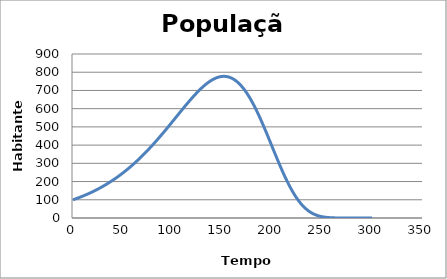
| Category | Series 0 |
|---|---|
| 1.0 | 100 |
| 2.0 | 101.9 |
| 3.0 | 103.834 |
| 4.0 | 105.803 |
| 5.0 | 107.806 |
| 6.0 | 109.846 |
| 7.0 | 111.922 |
| 8.0 | 114.034 |
| 9.0 | 116.184 |
| 10.0 | 118.371 |
| 11.0 | 120.597 |
| 12.0 | 122.862 |
| 13.0 | 125.166 |
| 14.0 | 127.511 |
| 15.0 | 129.896 |
| 16.0 | 132.323 |
| 17.0 | 134.791 |
| 18.0 | 137.302 |
| 19.0 | 139.855 |
| 20.0 | 142.453 |
| 21.0 | 145.094 |
| 22.0 | 147.78 |
| 23.0 | 150.512 |
| 24.0 | 153.289 |
| 25.0 | 156.113 |
| 26.0 | 158.984 |
| 27.0 | 161.903 |
| 28.0 | 164.87 |
| 29.0 | 167.885 |
| 30.0 | 170.951 |
| 31.0 | 174.066 |
| 32.0 | 177.232 |
| 33.0 | 180.449 |
| 34.0 | 183.717 |
| 35.0 | 187.038 |
| 36.0 | 190.412 |
| 37.0 | 193.839 |
| 38.0 | 197.32 |
| 39.0 | 200.855 |
| 40.0 | 204.446 |
| 41.0 | 208.091 |
| 42.0 | 211.793 |
| 43.0 | 215.551 |
| 44.0 | 219.367 |
| 45.0 | 223.239 |
| 46.0 | 227.17 |
| 47.0 | 231.159 |
| 48.0 | 235.206 |
| 49.0 | 239.313 |
| 50.0 | 243.479 |
| 51.0 | 247.705 |
| 52.0 | 251.991 |
| 53.0 | 256.338 |
| 54.0 | 260.746 |
| 55.0 | 265.215 |
| 56.0 | 269.745 |
| 57.0 | 274.336 |
| 58.0 | 278.99 |
| 59.0 | 283.705 |
| 60.0 | 288.483 |
| 61.0 | 293.323 |
| 62.0 | 298.224 |
| 63.0 | 303.189 |
| 64.0 | 308.215 |
| 65.0 | 313.303 |
| 66.0 | 318.454 |
| 67.0 | 323.667 |
| 68.0 | 328.941 |
| 69.0 | 334.276 |
| 70.0 | 339.673 |
| 71.0 | 345.131 |
| 72.0 | 350.649 |
| 73.0 | 356.227 |
| 74.0 | 361.865 |
| 75.0 | 367.561 |
| 76.0 | 373.316 |
| 77.0 | 379.128 |
| 78.0 | 384.997 |
| 79.0 | 390.922 |
| 80.0 | 396.902 |
| 81.0 | 402.936 |
| 82.0 | 409.023 |
| 83.0 | 415.161 |
| 84.0 | 421.35 |
| 85.0 | 427.588 |
| 86.0 | 433.874 |
| 87.0 | 440.206 |
| 88.0 | 446.582 |
| 89.0 | 453.001 |
| 90.0 | 459.462 |
| 91.0 | 465.961 |
| 92.0 | 472.497 |
| 93.0 | 479.069 |
| 94.0 | 485.673 |
| 95.0 | 492.307 |
| 96.0 | 498.969 |
| 97.0 | 505.656 |
| 98.0 | 512.366 |
| 99.0 | 519.096 |
| 100.0 | 525.841 |
| 101.0 | 532.601 |
| 102.0 | 539.371 |
| 103.0 | 546.147 |
| 104.0 | 552.927 |
| 105.0 | 559.706 |
| 106.0 | 566.481 |
| 107.0 | 573.249 |
| 108.0 | 580.003 |
| 109.0 | 586.742 |
| 110.0 | 593.459 |
| 111.0 | 600.151 |
| 112.0 | 606.813 |
| 113.0 | 613.44 |
| 114.0 | 620.026 |
| 115.0 | 626.568 |
| 116.0 | 633.059 |
| 117.0 | 639.494 |
| 118.0 | 645.867 |
| 119.0 | 652.173 |
| 120.0 | 658.405 |
| 121.0 | 664.559 |
| 122.0 | 670.626 |
| 123.0 | 676.602 |
| 124.0 | 682.479 |
| 125.0 | 688.251 |
| 126.0 | 693.911 |
| 127.0 | 699.452 |
| 128.0 | 704.867 |
| 129.0 | 710.149 |
| 130.0 | 715.291 |
| 131.0 | 720.285 |
| 132.0 | 725.125 |
| 133.0 | 729.801 |
| 134.0 | 734.307 |
| 135.0 | 738.635 |
| 136.0 | 742.777 |
| 137.0 | 746.726 |
| 138.0 | 750.473 |
| 139.0 | 754.01 |
| 140.0 | 757.33 |
| 141.0 | 760.425 |
| 142.0 | 763.286 |
| 143.0 | 765.906 |
| 144.0 | 768.277 |
| 145.0 | 770.391 |
| 146.0 | 772.241 |
| 147.0 | 773.818 |
| 148.0 | 775.116 |
| 149.0 | 776.126 |
| 150.0 | 776.842 |
| 151.0 | 777.257 |
| 152.0 | 777.363 |
| 153.0 | 777.154 |
| 154.0 | 776.623 |
| 155.0 | 775.765 |
| 156.0 | 774.573 |
| 157.0 | 773.042 |
| 158.0 | 771.167 |
| 159.0 | 768.943 |
| 160.0 | 766.364 |
| 161.0 | 763.428 |
| 162.0 | 760.131 |
| 163.0 | 756.468 |
| 164.0 | 752.439 |
| 165.0 | 748.039 |
| 166.0 | 743.269 |
| 167.0 | 738.126 |
| 168.0 | 732.61 |
| 169.0 | 726.722 |
| 170.0 | 720.462 |
| 171.0 | 713.831 |
| 172.0 | 706.831 |
| 173.0 | 699.467 |
| 174.0 | 691.74 |
| 175.0 | 683.654 |
| 176.0 | 675.217 |
| 177.0 | 666.431 |
| 178.0 | 657.305 |
| 179.0 | 647.846 |
| 180.0 | 638.062 |
| 181.0 | 627.96 |
| 182.0 | 617.552 |
| 183.0 | 606.848 |
| 184.0 | 595.859 |
| 185.0 | 584.596 |
| 186.0 | 573.073 |
| 187.0 | 561.303 |
| 188.0 | 549.301 |
| 189.0 | 537.081 |
| 190.0 | 524.659 |
| 191.0 | 512.051 |
| 192.0 | 499.275 |
| 193.0 | 486.348 |
| 194.0 | 473.287 |
| 195.0 | 460.112 |
| 196.0 | 446.841 |
| 197.0 | 433.494 |
| 198.0 | 420.091 |
| 199.0 | 406.651 |
| 200.0 | 393.195 |
| 201.0 | 379.744 |
| 202.0 | 366.317 |
| 203.0 | 352.936 |
| 204.0 | 339.621 |
| 205.0 | 326.392 |
| 206.0 | 313.269 |
| 207.0 | 300.272 |
| 208.0 | 287.422 |
| 209.0 | 274.736 |
| 210.0 | 262.233 |
| 211.0 | 249.932 |
| 212.0 | 237.849 |
| 213.0 | 226.002 |
| 214.0 | 214.405 |
| 215.0 | 203.074 |
| 216.0 | 192.023 |
| 217.0 | 181.265 |
| 218.0 | 170.81 |
| 219.0 | 160.672 |
| 220.0 | 150.858 |
| 221.0 | 141.377 |
| 222.0 | 132.236 |
| 223.0 | 123.442 |
| 224.0 | 115 |
| 225.0 | 106.911 |
| 226.0 | 99.179 |
| 227.0 | 91.805 |
| 228.0 | 84.787 |
| 229.0 | 78.125 |
| 230.0 | 71.816 |
| 231.0 | 65.855 |
| 232.0 | 60.237 |
| 233.0 | 54.957 |
| 234.0 | 50.008 |
| 235.0 | 45.38 |
| 236.0 | 41.065 |
| 237.0 | 37.054 |
| 238.0 | 33.336 |
| 239.0 | 29.9 |
| 240.0 | 26.734 |
| 241.0 | 23.826 |
| 242.0 | 21.164 |
| 243.0 | 18.735 |
| 244.0 | 16.527 |
| 245.0 | 14.526 |
| 246.0 | 12.72 |
| 247.0 | 11.095 |
| 248.0 | 9.639 |
| 249.0 | 8.34 |
| 250.0 | 7.186 |
| 251.0 | 6.164 |
| 252.0 | 5.264 |
| 253.0 | 4.474 |
| 254.0 | 3.784 |
| 255.0 | 3.185 |
| 256.0 | 2.667 |
| 257.0 | 2.221 |
| 258.0 | 1.84 |
| 259.0 | 1.515 |
| 260.0 | 1.24 |
| 261.0 | 1.009 |
| 262.0 | 0.816 |
| 263.0 | 0.655 |
| 264.0 | 0.522 |
| 265.0 | 0.413 |
| 266.0 | 0.325 |
| 267.0 | 0.253 |
| 268.0 | 0.196 |
| 269.0 | 0.15 |
| 270.0 | 0.114 |
| 271.0 | 0.086 |
| 272.0 | 0.064 |
| 273.0 | 0.047 |
| 274.0 | 0.035 |
| 275.0 | 0.025 |
| 276.0 | 0.018 |
| 277.0 | 0.013 |
| 278.0 | 0.009 |
| 279.0 | 0.006 |
| 280.0 | 0.004 |
| 281.0 | 0.003 |
| 282.0 | 0.002 |
| 283.0 | 0.001 |
| 284.0 | 0.001 |
| 285.0 | 0 |
| 286.0 | 0 |
| 287.0 | 0 |
| 288.0 | 0 |
| 289.0 | 0 |
| 290.0 | 0 |
| 291.0 | 0 |
| 292.0 | 0 |
| 293.0 | 0 |
| 294.0 | 0 |
| 295.0 | 0 |
| 296.0 | 0 |
| 297.0 | 0 |
| 298.0 | 0 |
| 299.0 | 0 |
| 300.0 | 0 |